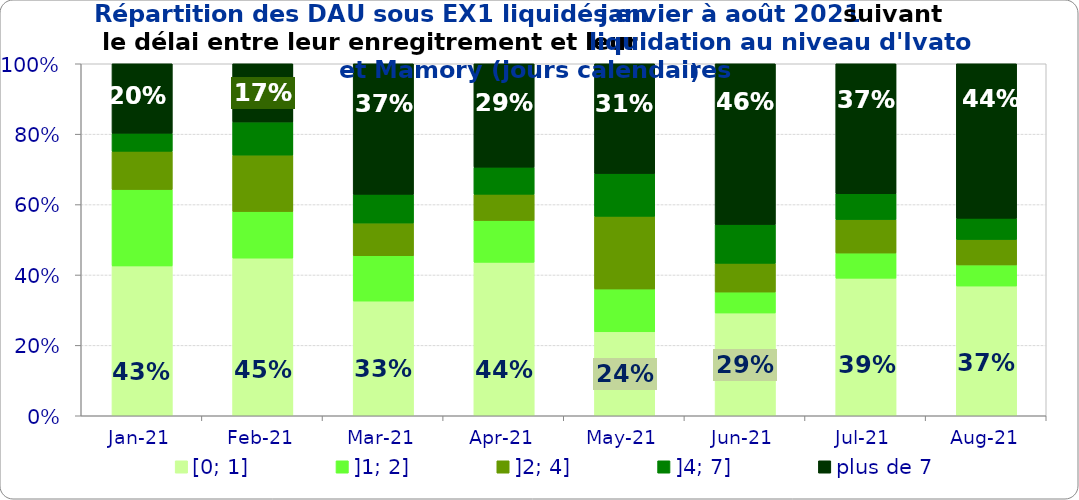
| Category | [0; 1] | ]1; 2] | ]2; 4] | ]4; 7] | plus de 7 |
|---|---|---|---|---|---|
| 2021-01-01 | 0.426 | 0.217 | 0.109 | 0.051 | 0.197 |
| 2021-02-01 | 0.448 | 0.132 | 0.16 | 0.094 | 0.165 |
| 2021-03-01 | 0.326 | 0.129 | 0.093 | 0.081 | 0.371 |
| 2021-04-01 | 0.436 | 0.119 | 0.075 | 0.077 | 0.294 |
| 2021-05-01 | 0.239 | 0.122 | 0.206 | 0.122 | 0.312 |
| 2021-06-01 | 0.292 | 0.059 | 0.081 | 0.11 | 0.457 |
| 2021-07-01 | 0.391 | 0.071 | 0.095 | 0.073 | 0.369 |
| 2021-08-01 | 0.369 | 0.06 | 0.072 | 0.06 | 0.439 |